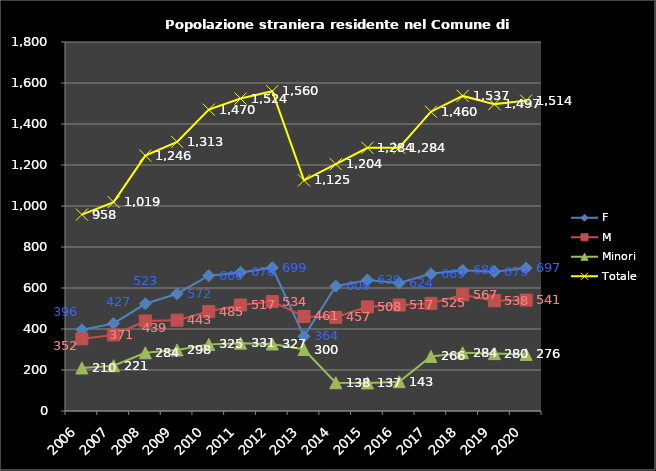
| Category | F | M | Minori | Totale |
|---|---|---|---|---|
| 2006.0 | 396 | 352 | 210 | 958 |
| 2007.0 | 427 | 371 | 221 | 1019 |
| 2008.0 | 523 | 439 | 284 | 1246 |
| 2009.0 | 572 | 443 | 298 | 1313 |
| 2010.0 | 660 | 485 | 325 | 1470 |
| 2011.0 | 676 | 517 | 331 | 1524 |
| 2012.0 | 699 | 534 | 327 | 1560 |
| 2013.0 | 364 | 461 | 300 | 1125 |
| 2014.0 | 609 | 457 | 138 | 1204 |
| 2015.0 | 639 | 508 | 137 | 1284 |
| 2016.0 | 624 | 517 | 143 | 1284 |
| 2017.0 | 669 | 525 | 266 | 1460 |
| 2018.0 | 686 | 567 | 284 | 1537 |
| 2019.0 | 679 | 538 | 280 | 1497 |
| 2020.0 | 697 | 541 | 276 | 1514 |